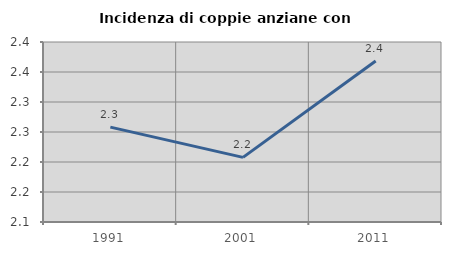
| Category | Incidenza di coppie anziane con figli |
|---|---|
| 1991.0 | 2.258 |
| 2001.0 | 2.208 |
| 2011.0 | 2.368 |